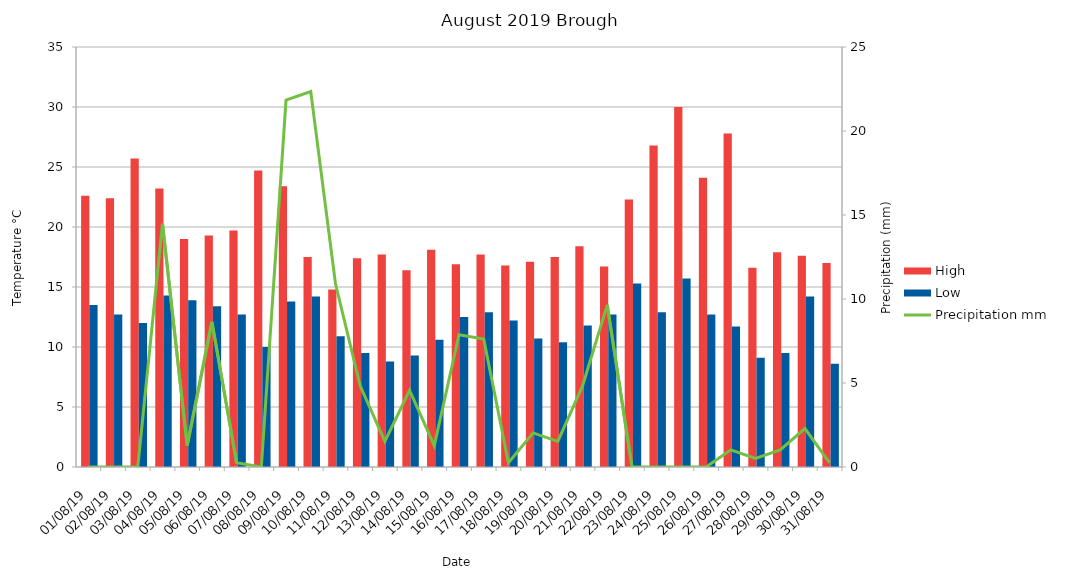
| Category | High | Low |
|---|---|---|
| 01/08/19 | 22.6 | 13.5 |
| 02/08/19 | 22.4 | 12.7 |
| 03/08/19 | 25.7 | 12 |
| 04/08/19 | 23.2 | 14.3 |
| 05/08/19 | 19 | 13.9 |
| 06/08/19 | 19.3 | 13.4 |
| 07/08/19 | 19.7 | 12.7 |
| 08/08/19 | 24.7 | 10 |
| 09/08/19 | 23.4 | 13.8 |
| 10/08/19 | 17.5 | 14.2 |
| 11/08/19 | 14.8 | 10.9 |
| 12/08/19 | 17.4 | 9.5 |
| 13/08/19 | 17.7 | 8.8 |
| 14/08/19 | 16.4 | 9.3 |
| 15/08/19 | 18.1 | 10.6 |
| 16/08/19 | 16.9 | 12.5 |
| 17/08/19 | 17.7 | 12.9 |
| 18/08/19 | 16.8 | 12.2 |
| 19/08/19 | 17.1 | 10.7 |
| 20/08/19 | 17.5 | 10.4 |
| 21/08/19 | 18.4 | 11.8 |
| 22/08/19 | 16.7 | 12.7 |
| 23/08/19 | 22.3 | 15.3 |
| 24/08/19 | 26.8 | 12.9 |
| 25/08/19 | 30 | 15.7 |
| 26/08/19 | 24.1 | 12.7 |
| 27/08/19 | 27.8 | 11.7 |
| 28/08/19 | 16.6 | 9.1 |
| 29/08/19 | 17.9 | 9.5 |
| 30/08/19 | 17.6 | 14.2 |
| 31/08/19 | 17 | 8.6 |